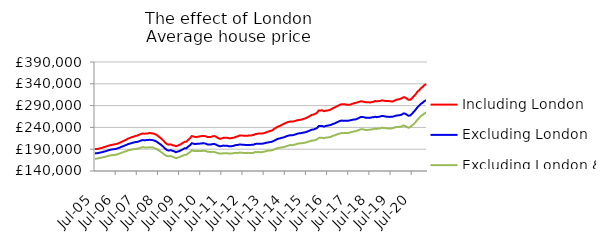
| Category | Including London | Excluding London | Excluding London & SE |
|---|---|---|---|
| 2005-07-01 | 190099.846 | 180338.943 | 168115.943 |
| 2005-08-01 | 190409.416 | 180707.116 | 168387.745 |
| 2005-09-01 | 191025.705 | 181294.079 | 169165.237 |
| 2005-10-01 | 192128.229 | 182260.003 | 170136.846 |
| 2005-11-01 | 193022.749 | 183020.557 | 170802.395 |
| 2005-12-01 | 194589.472 | 184321.051 | 171890.78 |
| 2006-01-01 | 195561.889 | 185223.855 | 172601.05 |
| 2006-02-01 | 197180.233 | 186694.526 | 173973.307 |
| 2006-03-01 | 198290.018 | 187883.534 | 175074.67 |
| 2006-04-01 | 199521.21 | 188954.872 | 175987.174 |
| 2006-05-01 | 200291.878 | 189620.06 | 176437.969 |
| 2006-06-01 | 200874.24 | 190048.53 | 176847.591 |
| 2006-07-01 | 201753.772 | 190830.896 | 177451.803 |
| 2006-08-01 | 202945.476 | 191932.237 | 178625.067 |
| 2006-09-01 | 204665.909 | 193486.107 | 180029.257 |
| 2006-10-01 | 206669.853 | 195431.198 | 181917.714 |
| 2006-11-01 | 208271.992 | 196704.296 | 182996.889 |
| 2006-12-01 | 210431.706 | 198484.218 | 184628.33 |
| 2007-01-01 | 212236.573 | 199867.99 | 185753.039 |
| 2007-02-01 | 214691.924 | 201953.448 | 187491.53 |
| 2007-03-01 | 215960.598 | 202950.014 | 188129.855 |
| 2007-04-01 | 217668.208 | 204390.327 | 189305.612 |
| 2007-05-01 | 218745.526 | 205176.529 | 190051.523 |
| 2007-06-01 | 220436.757 | 206350.676 | 190766.928 |
| 2007-07-01 | 221128.98 | 206601.586 | 190934.336 |
| 2007-08-01 | 222903.284 | 208023.687 | 191970.933 |
| 2007-09-01 | 224639.27 | 209648.69 | 193488.751 |
| 2007-10-01 | 225909.983 | 210886.574 | 194554.085 |
| 2007-11-01 | 225637.65 | 210701.658 | 194139.319 |
| 2007-12-01 | 225795.991 | 210808.016 | 194100.151 |
| 2008-01-01 | 226230.744 | 210997.948 | 193849.067 |
| 2008-02-01 | 227150.677 | 211685.752 | 194629.825 |
| 2008-03-01 | 226536.237 | 211131.036 | 194027.854 |
| 2008-04-01 | 226088.749 | 210687.499 | 193735.581 |
| 2008-05-01 | 224583.894 | 209243.33 | 192031.653 |
| 2008-06-01 | 222870.934 | 207605.676 | 190599.84 |
| 2008-07-01 | 219624.904 | 204552.197 | 187738.181 |
| 2008-08-01 | 216697.269 | 201783.679 | 185273.991 |
| 2008-09-01 | 213087.292 | 198550.708 | 182220.184 |
| 2008-10-01 | 209193.305 | 194954.131 | 179292.765 |
| 2008-11-01 | 204692.274 | 190946.059 | 176189.96 |
| 2008-12-01 | 201599.231 | 187849.92 | 174117.242 |
| 2009-01-01 | 200403.32 | 186878.072 | 173689.928 |
| 2009-02-01 | 201116.809 | 187902.199 | 174505.275 |
| 2009-03-01 | 199383.582 | 186328.236 | 172948.571 |
| 2009-04-01 | 198315.606 | 185259.882 | 171374.665 |
| 2009-05-01 | 196756.715 | 183093.397 | 169466.686 |
| 2009-06-01 | 198255.489 | 184493.743 | 170575.472 |
| 2009-07-01 | 199781.16 | 185725.435 | 171866.354 |
| 2009-08-01 | 202057.625 | 187894.019 | 173683.287 |
| 2009-09-01 | 204651.712 | 189897.228 | 175272.485 |
| 2009-10-01 | 206995.738 | 192147.604 | 177124.978 |
| 2009-11-01 | 207417.779 | 192401.732 | 177434.262 |
| 2009-12-01 | 211553.202 | 196348.095 | 180850.865 |
| 2010-01-01 | 214966.047 | 198975.275 | 183057.657 |
| 2010-02-01 | 220222.605 | 203842.442 | 187600.547 |
| 2010-03-01 | 218833.653 | 202417 | 186103.773 |
| 2010-04-01 | 218095.869 | 201947.595 | 185606.518 |
| 2010-05-01 | 218270.945 | 202369.228 | 185653.56 |
| 2010-06-01 | 219021.418 | 202622.997 | 185715.112 |
| 2010-07-01 | 219694.86 | 202909.807 | 185694.318 |
| 2010-08-01 | 220453.705 | 203427.774 | 186228.655 |
| 2010-09-01 | 220333.072 | 203554.602 | 186584.363 |
| 2010-10-01 | 219430.502 | 202646.38 | 185826.104 |
| 2010-11-01 | 217758.718 | 200820.946 | 184169.331 |
| 2010-12-01 | 217843.886 | 200598.076 | 183920.647 |
| 2011-01-01 | 218308.872 | 200845.74 | 183620.819 |
| 2011-02-01 | 219903.599 | 201942.266 | 184034.672 |
| 2011-03-01 | 220093.176 | 201787.31 | 183239.142 |
| 2011-04-01 | 217992.594 | 199967.499 | 182219.013 |
| 2011-05-01 | 215269.271 | 198004.825 | 180728.026 |
| 2011-06-01 | 213677.232 | 196824.513 | 179824.569 |
| 2011-07-01 | 214756.836 | 197366.561 | 180053.186 |
| 2011-08-01 | 216261.648 | 198273.54 | 180722.379 |
| 2011-09-01 | 216160.859 | 198017.112 | 180733.396 |
| 2011-10-01 | 216413 | 198044.687 | 180992.117 |
| 2011-11-01 | 215076.714 | 196723.016 | 179930.308 |
| 2011-12-01 | 215195.615 | 196619.922 | 180098.389 |
| 2012-01-01 | 215831.279 | 197197.229 | 180433.467 |
| 2012-02-01 | 216608.392 | 198028.239 | 181160.203 |
| 2012-03-01 | 218433.925 | 199448.115 | 181654.074 |
| 2012-04-01 | 219229.758 | 199570.129 | 181401.405 |
| 2012-05-01 | 221315.79 | 200758.529 | 182172.379 |
| 2012-06-01 | 221273.57 | 200554.841 | 182125.023 |
| 2012-07-01 | 221114.337 | 200270.358 | 181588.763 |
| 2012-08-01 | 220621.314 | 199950.2 | 181454.035 |
| 2012-09-01 | 220819.802 | 199578.294 | 181206.962 |
| 2012-10-01 | 221141.866 | 199928.213 | 181838.461 |
| 2012-11-01 | 221164.226 | 199365.164 | 181019.915 |
| 2012-12-01 | 221860.869 | 200187.818 | 181487.387 |
| 2013-01-01 | 222596.882 | 200321.308 | 181562.915 |
| 2013-02-01 | 224450.937 | 202165.818 | 183480.908 |
| 2013-03-01 | 225296.589 | 202321.905 | 183206.742 |
| 2013-04-01 | 225849.652 | 202728.281 | 183560.204 |
| 2013-05-01 | 225718.614 | 202362.124 | 182827.175 |
| 2013-06-01 | 226002.925 | 202691.089 | 183604.49 |
| 2013-07-01 | 226930.605 | 203452.386 | 184205.442 |
| 2013-08-01 | 228408.536 | 204423.05 | 185436.988 |
| 2013-09-01 | 229824.697 | 205278.944 | 186429.386 |
| 2013-10-01 | 231209.99 | 206154.794 | 187034.581 |
| 2013-11-01 | 232088.932 | 206444.18 | 187070.066 |
| 2013-12-01 | 234238.428 | 208094.651 | 188041.365 |
| 2014-01-01 | 237365.145 | 210155.879 | 189823.412 |
| 2014-02-01 | 239694.72 | 212174.554 | 191400.886 |
| 2014-03-01 | 242055.681 | 214012.688 | 192900.354 |
| 2014-04-01 | 243338.29 | 214775.303 | 193389.924 |
| 2014-05-01 | 245816.756 | 216038.374 | 194254.493 |
| 2014-06-01 | 247723.782 | 216873.628 | 194603.277 |
| 2014-07-01 | 249499.817 | 218444.174 | 195701.02 |
| 2014-08-01 | 251313.134 | 220200.2 | 197405.702 |
| 2014-09-01 | 252749.811 | 221247.959 | 198503.997 |
| 2014-10-01 | 253554.587 | 222116.231 | 199576.85 |
| 2014-11-01 | 253513.511 | 222004.979 | 199176.596 |
| 2014-12-01 | 253886.163 | 222912.5 | 200103.642 |
| 2015-01-01 | 255260.291 | 224151.478 | 201048.861 |
| 2015-02-01 | 256442.252 | 225640.668 | 202626.686 |
| 2015-03-01 | 257148.908 | 226552.252 | 203261.427 |
| 2015-04-01 | 257702.233 | 226857.13 | 203464.345 |
| 2015-05-01 | 258891.89 | 227735.502 | 204003.881 |
| 2015-06-01 | 260266.761 | 228497.388 | 204654.697 |
| 2015-07-01 | 261578.962 | 229583.14 | 205554.043 |
| 2015-08-01 | 264001.261 | 231254.691 | 207167.691 |
| 2015-09-01 | 265964.492 | 232711.522 | 208140.346 |
| 2015-10-01 | 268628.509 | 234826.4 | 209815.018 |
| 2015-11-01 | 269111.396 | 234960.65 | 209639.335 |
| 2015-12-01 | 271150.763 | 236640.113 | 211071.853 |
| 2016-01-01 | 273132.57 | 238155.033 | 212260.808 |
| 2016-02-01 | 278749.158 | 242942.359 | 215948.01 |
| 2016-03-01 | 279015.252 | 243059.927 | 216042.757 |
| 2016-04-01 | 279083.931 | 243156.96 | 216229.924 |
| 2016-05-01 | 277191.159 | 241777.856 | 215266.08 |
| 2016-06-01 | 278300.659 | 243277.523 | 216464.604 |
| 2016-07-01 | 278735.279 | 244000.624 | 216833.27 |
| 2016-08-01 | 279550.537 | 244824.223 | 217449.986 |
| 2016-09-01 | 281143.525 | 245745.556 | 218307.062 |
| 2016-10-01 | 283844.145 | 247892.088 | 220607.247 |
| 2016-11-01 | 285456.064 | 248896.599 | 221544.872 |
| 2016-12-01 | 287658.857 | 250984.14 | 223268.01 |
| 2017-01-01 | 289822.876 | 252856.968 | 224563.197 |
| 2017-02-01 | 291690.019 | 254624.594 | 226037.212 |
| 2017-03-01 | 293217.574 | 255694.681 | 227103.647 |
| 2017-04-01 | 293135.305 | 255292.47 | 226801.402 |
| 2017-05-01 | 293034.824 | 255419.745 | 227111.743 |
| 2017-06-01 | 291896.223 | 255008.621 | 226919.533 |
| 2017-07-01 | 291758.358 | 255528.067 | 227535.038 |
| 2017-08-01 | 292226.381 | 256292.983 | 228386.334 |
| 2017-09-01 | 294023.961 | 257274.595 | 229630.433 |
| 2017-10-01 | 295304.478 | 258022.621 | 230765.593 |
| 2017-11-01 | 296276.989 | 258364.335 | 231354.162 |
| 2017-12-01 | 297197.81 | 259939.638 | 232603.923 |
| 2018-01-01 | 298811.713 | 262071.424 | 234229.967 |
| 2018-02-01 | 300029.625 | 264099.346 | 235949.705 |
| 2018-03-01 | 299205.749 | 263836.12 | 235633.643 |
| 2018-04-01 | 298409.542 | 263175.091 | 234927.027 |
| 2018-05-01 | 297506.941 | 261851.64 | 233870.644 |
| 2018-06-01 | 297959.121 | 262280.237 | 234472.165 |
| 2018-07-01 | 297018.79 | 261760.695 | 234340.531 |
| 2018-08-01 | 297858.66 | 262927.093 | 235563.171 |
| 2018-09-01 | 298624.478 | 263218.429 | 235954.032 |
| 2018-10-01 | 300545.418 | 264469.385 | 237346.704 |
| 2018-11-01 | 299652.448 | 263523.362 | 236597.887 |
| 2018-12-01 | 300349.168 | 264311.745 | 237550.778 |
| 2019-01-01 | 300797.826 | 264937.704 | 237849.686 |
| 2019-02-01 | 302149.078 | 266418.975 | 239203.748 |
| 2019-03-01 | 301209.863 | 265776.004 | 238643.338 |
| 2019-04-01 | 300448.054 | 264869.293 | 238200.831 |
| 2019-05-01 | 300433.595 | 264305.857 | 237799.923 |
| 2019-06-01 | 300235.304 | 264098.537 | 237343.419 |
| 2019-07-01 | 299725.745 | 264203.148 | 237521.622 |
| 2019-08-01 | 299567.415 | 264552.195 | 238040.975 |
| 2019-09-01 | 301214.163 | 265749.854 | 239621.052 |
| 2019-10-01 | 303183.912 | 267081.618 | 240884.038 |
| 2019-11-01 | 304171.981 | 267442.68 | 240925.05 |
| 2019-12-01 | 305042.915 | 268115.294 | 241385.38 |
| 2020-01-01 | 306309.312 | 269017.947 | 241981.298 |
| 2020-02-01 | 308887.716 | 271710.988 | 244448.707 |
| 2020-03-01 | 309003.919 | 271671.265 | 243501.286 |
| 2020-04-01 | 306007.158 | 269226.481 | 241047.929 |
| 2020-05-01 | 303246.043 | 266717.003 | 239169.243 |
| 2020-06-01 | 303503.084 | 267437.722 | 240882.055 |
| 2020-07-01 | 306966.544 | 271287.429 | 244369.709 |
| 2020-08-01 | 311457.244 | 275766.286 | 247835.877 |
| 2020-09-01 | 315710.066 | 280380.215 | 252019.413 |
| 2020-10-01 | 321580.139 | 285827.575 | 257412.368 |
| 2020-11-01 | 324731.907 | 289665.773 | 261552.94 |
| 2020-12-01 | 329640.06 | 293978.162 | 265793.478 |
| 2021-01-01 | 332538.207 | 296636.299 | 268467.273 |
| 2021-02-01 | 336862.046 | 300182.258 | 271943.626 |
| 2021-03-01 | 339160.423 | 302338.825 | 274057.261 |